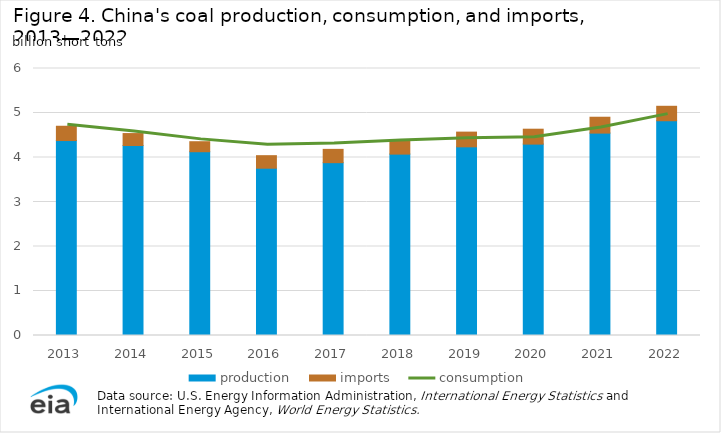
| Category | production | imports |
|---|---|---|
| 2013.0 | 4.381 | 0.321 |
| 2014.0 | 4.27 | 0.268 |
| 2015.0 | 4.13 | 0.225 |
| 2016.0 | 3.76 | 0.282 |
| 2017.0 | 3.884 | 0.299 |
| 2018.0 | 4.076 | 0.31 |
| 2019.0 | 4.24 | 0.331 |
| 2020.0 | 4.301 | 0.335 |
| 2021.0 | 4.548 | 0.357 |
| 2022.0 | 4.826 | 0.325 |